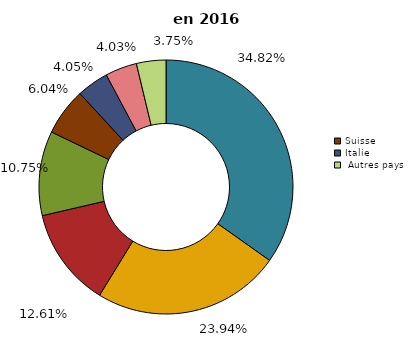
| Category | Series 0 |
|---|---|
| Belgique | 129738716.97 |
| Espagne | 89221718.16 |
| Portugal | 46999916.43 |
| Allemagne | 40053948.77 |
| Suisse | 22490195.806 |
| Italie | 15107239.18 |
| Luxembourg | 15032142.94 |
| Autres pays | 13970519.397 |